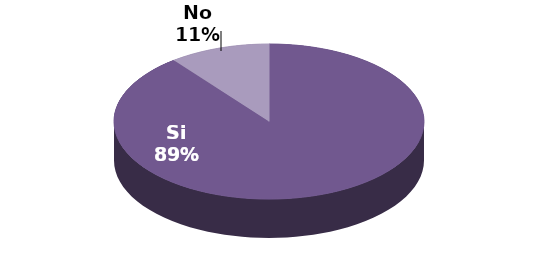
| Category | Series 1 |
|---|---|
| Si | 17 |
| No | 2 |